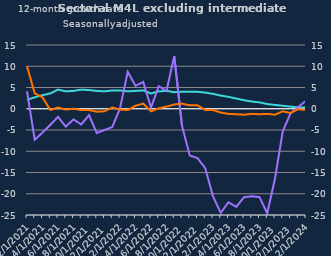
| Category | zero | Households | Non-intermediate OFCs |
|---|---|---|---|
| Feb-2021 | 0 | 2.1 | 4.1 |
| Mar-2021 | 0 | 2.7 | -7.3 |
| Apr-2021 | 0 | 3.2 | -5.6 |
| May-2021 | 0 | 3.6 | -3.8 |
| Jun-2021 | 0 | 4.5 | -1.9 |
| Jul-2021 | 0 | 4.1 | -4.2 |
| Aug-2021 | 0 | 4.2 | -2.5 |
| Sep-2021 | 0 | 4.5 | -3.7 |
| Oct-2021 | 0 | 4.4 | -1.5 |
| Nov-2021 | 0 | 4.2 | -5.7 |
| Dec-2021 | 0 | 4.1 | -5 |
| Jan-2022 | 0 | 4.3 | -4.3 |
| Feb-2022 | 0 | 4.3 | 0.1 |
| Mar-2022 | 0 | 4.1 | 8.7 |
| Apr-2022 | 0 | 4.2 | 5.4 |
| May-2022 | 0 | 4.3 | 6.3 |
| Jun-2022 | 0 | 3.6 | 0.3 |
| Jul-2022 | 0 | 4.1 | 5.3 |
| Aug-2022 | 0 | 4.2 | 4.2 |
| Sep-2022 | 0 | 3.9 | 12.4 |
| Oct-2022 | 0 | 4 | -4 |
| Nov-2022 | 0 | 4 | -11 |
| Dec-2022 | 0 | 4 | -11.6 |
| Jan-2023 | 0 | 3.8 | -14 |
| Feb-2023 | 0 | 3.5 | -20.6 |
| Mar-2023 | 0 | 3.1 | -24.5 |
| Apr-2023 | 0 | 2.8 | -22 |
| May-2023 | 0 | 2.4 | -23.1 |
| Jun-2023 | 0 | 2 | -20.8 |
| Jul-2023 | 0 | 1.7 | -20.6 |
| Aug-2023 | 0 | 1.5 | -20.8 |
| Sep-2023 | 0 | 1.1 | -24.6 |
| Oct-2023 | 0 | 0.9 | -16.4 |
| Nov-2023 | 0 | 0.7 | -5.3 |
| Dec-2023 | 0 | 0.5 | -1.1 |
| Jan-2024 | 0 | 0.3 | 0.4 |
| Feb-2024 | 0 | 0.3 | 1.9 |